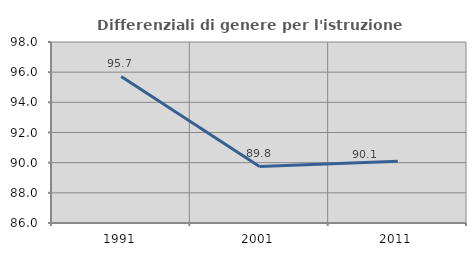
| Category | Differenziali di genere per l'istruzione superiore |
|---|---|
| 1991.0 | 95.718 |
| 2001.0 | 89.751 |
| 2011.0 | 90.097 |